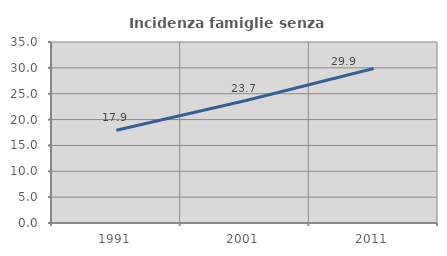
| Category | Incidenza famiglie senza nuclei |
|---|---|
| 1991.0 | 17.93 |
| 2001.0 | 23.651 |
| 2011.0 | 29.887 |